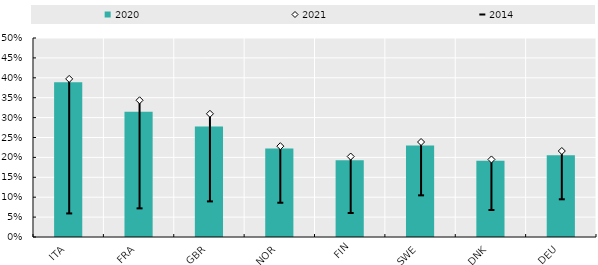
| Category | 2020 |
|---|---|
| ITA | 0.389 |
| FRA | 0.314 |
| GBR | 0.278 |
| NOR | 0.222 |
| FIN | 0.193 |
| SWE | 0.23 |
| DNK | 0.192 |
| DEU | 0.205 |